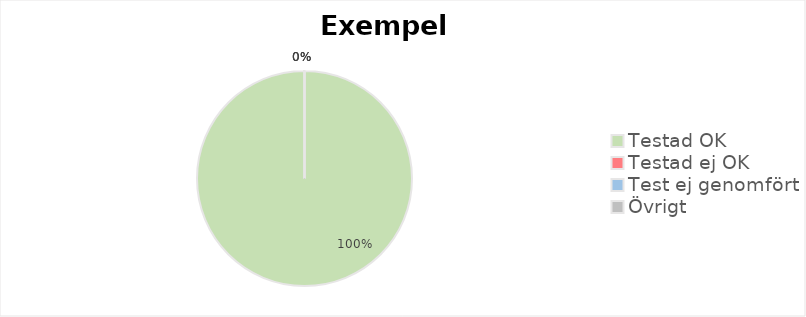
| Category | Series 0 |
|---|---|
| Testad OK | 1 |
| Testad ej OK | 0 |
| Test ej genomfört | 0 |
| Övrigt | 0 |